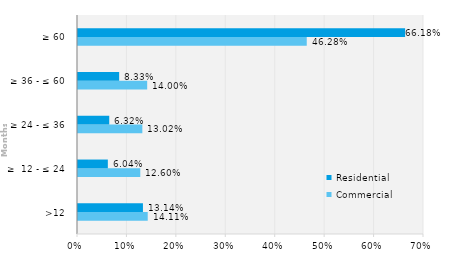
| Category | Commercial | Residential |
|---|---|---|
| >12 | 0.141 | 0.131 |
| ≥  12 - ≤ 24 | 0.126 | 0.06 |
| ≥ 24 - ≤ 36 | 0.13 | 0.063 |
| ≥ 36 - ≤ 60 | 0.14 | 0.083 |
| ≥ 60 | 0.463 | 0.662 |